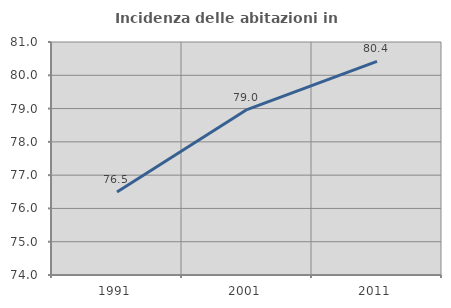
| Category | Incidenza delle abitazioni in proprietà  |
|---|---|
| 1991.0 | 76.494 |
| 2001.0 | 78.97 |
| 2011.0 | 80.416 |